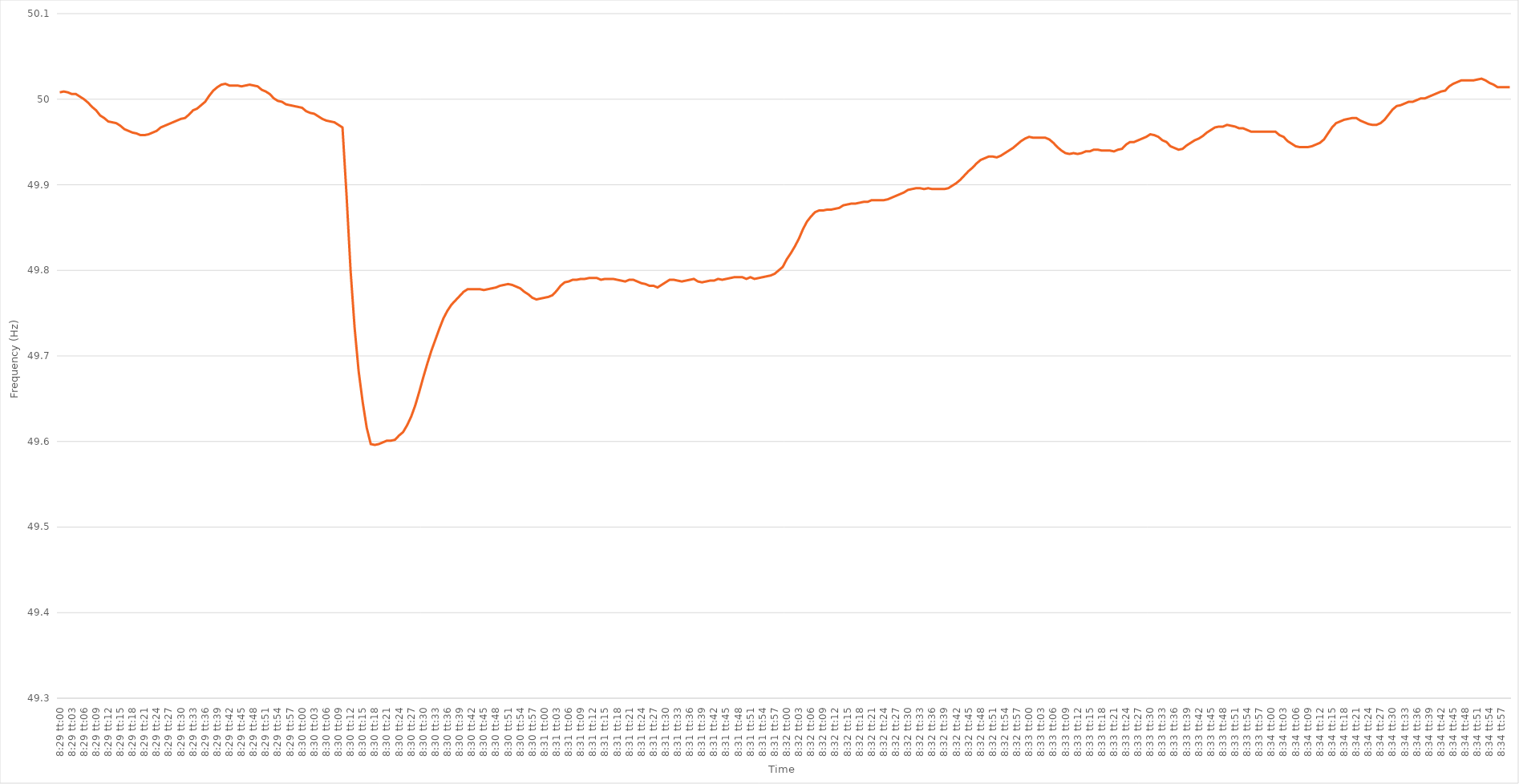
| Category | Series 0 |
|---|---|
| 0.3534722222222222 | 50.008 |
| 0.3534837962962963 | 50.009 |
| 0.3534953703703703 | 50.008 |
| 0.35350694444444447 | 50.006 |
| 0.3535185185185185 | 50.006 |
| 0.3535300925925926 | 50.003 |
| 0.35354166666666664 | 50 |
| 0.35355324074074074 | 49.996 |
| 0.3535648148148148 | 49.991 |
| 0.3535763888888889 | 49.987 |
| 0.35358796296296297 | 49.981 |
| 0.35359953703703706 | 49.978 |
| 0.3536111111111111 | 49.974 |
| 0.3536226851851852 | 49.973 |
| 0.35363425925925923 | 49.972 |
| 0.3536458333333334 | 49.969 |
| 0.3536574074074074 | 49.965 |
| 0.3536689814814815 | 49.963 |
| 0.35368055555555555 | 49.961 |
| 0.35369212962962965 | 49.96 |
| 0.3537037037037037 | 49.958 |
| 0.3537152777777777 | 49.958 |
| 0.3537268518518519 | 49.959 |
| 0.3537384259259259 | 49.961 |
| 0.35375 | 49.963 |
| 0.35376157407407405 | 49.967 |
| 0.35377314814814814 | 49.969 |
| 0.3537847222222222 | 49.971 |
| 0.35379629629629633 | 49.973 |
| 0.35380787037037037 | 49.975 |
| 0.35381944444444446 | 49.977 |
| 0.3538310185185185 | 49.978 |
| 0.3538425925925926 | 49.982 |
| 0.35385416666666664 | 49.987 |
| 0.3538657407407408 | 49.989 |
| 0.3538773148148148 | 49.993 |
| 0.3538888888888889 | 49.997 |
| 0.35390046296296296 | 50.004 |
| 0.35391203703703705 | 50.01 |
| 0.3539236111111111 | 50.014 |
| 0.35393518518518513 | 50.017 |
| 0.3539467592592593 | 50.018 |
| 0.3539583333333333 | 50.016 |
| 0.3539699074074074 | 50.016 |
| 0.35398148148148145 | 50.016 |
| 0.35399305555555555 | 50.015 |
| 0.3540046296296296 | 50.016 |
| 0.35401620370370374 | 50.017 |
| 0.3540277777777778 | 50.016 |
| 0.35403935185185187 | 50.015 |
| 0.3540509259259259 | 50.011 |
| 0.3540625 | 50.009 |
| 0.35407407407407404 | 50.006 |
| 0.3540856481481482 | 50.001 |
| 0.35409722222222223 | 49.998 |
| 0.3541087962962963 | 49.997 |
| 0.35412037037037036 | 49.994 |
| 0.35413194444444446 | 49.993 |
| 0.3541435185185185 | 49.992 |
| 0.35415509259259265 | 49.991 |
| 0.3541666666666667 | 49.99 |
| 0.3541782407407407 | 49.986 |
| 0.3541898148148148 | 49.984 |
| 0.35420138888888886 | 49.983 |
| 0.35421296296296295 | 49.98 |
| 0.354224537037037 | 49.977 |
| 0.35423611111111114 | 49.975 |
| 0.3542476851851852 | 49.974 |
| 0.3542592592592593 | 49.973 |
| 0.3542708333333333 | 49.97 |
| 0.3542824074074074 | 49.967 |
| 0.35429398148148145 | 49.888 |
| 0.3543055555555556 | 49.8 |
| 0.35431712962962963 | 49.733 |
| 0.35432870370370373 | 49.682 |
| 0.35434027777777777 | 49.646 |
| 0.35435185185185186 | 49.616 |
| 0.3543634259259259 | 49.597 |
| 0.35437500000000005 | 49.596 |
| 0.3543865740740741 | 49.597 |
| 0.3543981481481482 | 49.599 |
| 0.3544097222222222 | 49.601 |
| 0.35442129629629626 | 49.601 |
| 0.35443287037037036 | 49.602 |
| 0.3544444444444444 | 49.607 |
| 0.35445601851851855 | 49.611 |
| 0.3544675925925926 | 49.619 |
| 0.3544791666666667 | 49.629 |
| 0.3544907407407407 | 49.642 |
| 0.3545023148148148 | 49.658 |
| 0.35451388888888885 | 49.675 |
| 0.354525462962963 | 49.691 |
| 0.35453703703703704 | 49.706 |
| 0.35454861111111113 | 49.719 |
| 0.3545601851851852 | 49.732 |
| 0.35457175925925927 | 49.744 |
| 0.3545833333333333 | 49.753 |
| 0.35459490740740746 | 49.76 |
| 0.3546064814814815 | 49.765 |
| 0.3546180555555556 | 49.77 |
| 0.35462962962962963 | 49.775 |
| 0.35464120370370367 | 49.778 |
| 0.35465277777777776 | 49.778 |
| 0.3546643518518518 | 49.778 |
| 0.35467592592592595 | 49.778 |
| 0.3546875 | 49.777 |
| 0.3546990740740741 | 49.778 |
| 0.3547106481481481 | 49.779 |
| 0.3547222222222222 | 49.78 |
| 0.35473379629629626 | 49.782 |
| 0.3547453703703704 | 49.783 |
| 0.35475694444444444 | 49.784 |
| 0.35476851851851854 | 49.783 |
| 0.3547800925925926 | 49.781 |
| 0.35479166666666667 | 49.779 |
| 0.3548032407407407 | 49.775 |
| 0.35481481481481486 | 49.772 |
| 0.3548263888888889 | 49.768 |
| 0.354837962962963 | 49.766 |
| 0.35484953703703703 | 49.767 |
| 0.3548611111111111 | 49.768 |
| 0.35487268518518517 | 49.769 |
| 0.3548842592592593 | 49.771 |
| 0.35489583333333335 | 49.776 |
| 0.3549074074074074 | 49.782 |
| 0.3549189814814815 | 49.786 |
| 0.3549305555555555 | 49.787 |
| 0.3549421296296296 | 49.789 |
| 0.35495370370370366 | 49.789 |
| 0.3549652777777778 | 49.79 |
| 0.35497685185185185 | 49.79 |
| 0.35498842592592594 | 49.791 |
| 0.355 | 49.791 |
| 0.3550115740740741 | 49.791 |
| 0.3550231481481481 | 49.789 |
| 0.35503472222222227 | 49.79 |
| 0.3550462962962963 | 49.79 |
| 0.3550578703703704 | 49.79 |
| 0.35506944444444444 | 49.789 |
| 0.35508101851851853 | 49.788 |
| 0.35509259259259257 | 49.787 |
| 0.3551041666666667 | 49.789 |
| 0.35511574074074076 | 49.789 |
| 0.3551273148148148 | 49.787 |
| 0.3551388888888889 | 49.785 |
| 0.35515046296296293 | 49.784 |
| 0.355162037037037 | 49.782 |
| 0.35517361111111106 | 49.782 |
| 0.3551851851851852 | 49.78 |
| 0.35519675925925925 | 49.783 |
| 0.35520833333333335 | 49.786 |
| 0.3552199074074074 | 49.789 |
| 0.3552314814814815 | 49.789 |
| 0.3552430555555555 | 49.788 |
| 0.35525462962962967 | 49.787 |
| 0.3552662037037037 | 49.788 |
| 0.3552777777777778 | 49.789 |
| 0.35528935185185184 | 49.79 |
| 0.35530092592592594 | 49.787 |
| 0.3553125 | 49.786 |
| 0.3553240740740741 | 49.787 |
| 0.35533564814814816 | 49.788 |
| 0.3553472222222222 | 49.788 |
| 0.3553587962962963 | 49.79 |
| 0.35537037037037034 | 49.789 |
| 0.35538194444444443 | 49.79 |
| 0.35539351851851847 | 49.791 |
| 0.3554050925925926 | 49.792 |
| 0.35541666666666666 | 49.792 |
| 0.35542824074074075 | 49.792 |
| 0.3554398148148148 | 49.79 |
| 0.3554513888888889 | 49.792 |
| 0.3554629629629629 | 49.79 |
| 0.3554745370370371 | 49.791 |
| 0.3554861111111111 | 49.792 |
| 0.3554976851851852 | 49.793 |
| 0.35550925925925925 | 49.794 |
| 0.35552083333333334 | 49.796 |
| 0.3555324074074074 | 49.8 |
| 0.35554398148148153 | 49.804 |
| 0.35555555555555557 | 49.813 |
| 0.35556712962962966 | 49.82 |
| 0.3555787037037037 | 49.828 |
| 0.35559027777777774 | 49.837 |
| 0.35560185185185184 | 49.848 |
| 0.3556134259259259 | 49.857 |
| 0.355625 | 49.863 |
| 0.35563657407407406 | 49.868 |
| 0.35564814814814816 | 49.87 |
| 0.3556597222222222 | 49.87 |
| 0.3556712962962963 | 49.871 |
| 0.35568287037037033 | 49.871 |
| 0.3556944444444445 | 49.872 |
| 0.3557060185185185 | 49.873 |
| 0.3557175925925926 | 49.876 |
| 0.35572916666666665 | 49.877 |
| 0.35574074074074075 | 49.878 |
| 0.3557523148148148 | 49.878 |
| 0.35576388888888894 | 49.879 |
| 0.355775462962963 | 49.88 |
| 0.35578703703703707 | 49.88 |
| 0.3557986111111111 | 49.882 |
| 0.3558101851851852 | 49.882 |
| 0.35582175925925924 | 49.882 |
| 0.3558333333333333 | 49.882 |
| 0.35584490740740743 | 49.883 |
| 0.35585648148148147 | 49.885 |
| 0.35586805555555556 | 49.887 |
| 0.3558796296296296 | 49.889 |
| 0.3558912037037037 | 49.891 |
| 0.35590277777777773 | 49.894 |
| 0.3559143518518519 | 49.895 |
| 0.3559259259259259 | 49.896 |
| 0.3559375 | 49.896 |
| 0.35594907407407406 | 49.895 |
| 0.35596064814814815 | 49.896 |
| 0.3559722222222222 | 49.895 |
| 0.35598379629629634 | 49.895 |
| 0.3559953703703704 | 49.895 |
| 0.3560069444444445 | 49.895 |
| 0.3560185185185185 | 49.896 |
| 0.3560300925925926 | 49.899 |
| 0.35604166666666665 | 49.902 |
| 0.3560532407407408 | 49.906 |
| 0.35606481481481483 | 49.911 |
| 0.3560763888888889 | 49.916 |
| 0.35608796296296297 | 49.92 |
| 0.356099537037037 | 49.925 |
| 0.3561111111111111 | 49.929 |
| 0.35612268518518514 | 49.931 |
| 0.3561342592592593 | 49.933 |
| 0.35614583333333333 | 49.933 |
| 0.3561574074074074 | 49.932 |
| 0.35616898148148146 | 49.934 |
| 0.35618055555555556 | 49.937 |
| 0.3561921296296296 | 49.94 |
| 0.35620370370370374 | 49.943 |
| 0.3562152777777778 | 49.947 |
| 0.3562268518518519 | 49.951 |
| 0.3562384259259259 | 49.954 |
| 0.35625 | 49.956 |
| 0.35626157407407405 | 49.955 |
| 0.3562731481481482 | 49.955 |
| 0.35628472222222224 | 49.955 |
| 0.35629629629629633 | 49.955 |
| 0.35630787037037037 | 49.953 |
| 0.3563194444444444 | 49.949 |
| 0.3563310185185185 | 49.944 |
| 0.35634259259259254 | 49.94 |
| 0.3563541666666667 | 49.937 |
| 0.35636574074074073 | 49.936 |
| 0.3563773148148148 | 49.937 |
| 0.35638888888888887 | 49.936 |
| 0.35640046296296296 | 49.937 |
| 0.356412037037037 | 49.939 |
| 0.35642361111111115 | 49.939 |
| 0.3564351851851852 | 49.941 |
| 0.3564467592592593 | 49.941 |
| 0.3564583333333333 | 49.94 |
| 0.3564699074074074 | 49.94 |
| 0.35648148148148145 | 49.94 |
| 0.3564930555555556 | 49.939 |
| 0.35650462962962964 | 49.941 |
| 0.35651620370370374 | 49.942 |
| 0.3565277777777778 | 49.947 |
| 0.3565393518518518 | 49.95 |
| 0.3565509259259259 | 49.95 |
| 0.35656249999999995 | 49.952 |
| 0.3565740740740741 | 49.954 |
| 0.35658564814814814 | 49.956 |
| 0.35659722222222223 | 49.959 |
| 0.35660879629629627 | 49.958 |
| 0.35662037037037037 | 49.956 |
| 0.3566319444444444 | 49.952 |
| 0.35664351851851855 | 49.95 |
| 0.3566550925925926 | 49.945 |
| 0.3566666666666667 | 49.943 |
| 0.3566782407407407 | 49.941 |
| 0.3566898148148148 | 49.942 |
| 0.35670138888888886 | 49.946 |
| 0.356712962962963 | 49.949 |
| 0.35672453703703705 | 49.952 |
| 0.35673611111111114 | 49.954 |
| 0.3567476851851852 | 49.957 |
| 0.3567592592592593 | 49.961 |
| 0.3567708333333333 | 49.964 |
| 0.35678240740740735 | 49.967 |
| 0.3567939814814815 | 49.968 |
| 0.35680555555555554 | 49.968 |
| 0.35681712962962964 | 49.97 |
| 0.3568287037037037 | 49.969 |
| 0.35684027777777777 | 49.968 |
| 0.3568518518518518 | 49.966 |
| 0.35686342592592596 | 49.966 |
| 0.356875 | 49.964 |
| 0.3568865740740741 | 49.962 |
| 0.35689814814814813 | 49.962 |
| 0.3569097222222222 | 49.962 |
| 0.35692129629629626 | 49.962 |
| 0.3569328703703704 | 49.962 |
| 0.35694444444444445 | 49.962 |
| 0.35695601851851855 | 49.962 |
| 0.3569675925925926 | 49.958 |
| 0.3569791666666667 | 49.956 |
| 0.3569907407407407 | 49.951 |
| 0.35700231481481487 | 49.948 |
| 0.3570138888888889 | 49.945 |
| 0.35702546296296295 | 49.944 |
| 0.35703703703703704 | 49.944 |
| 0.3570486111111111 | 49.944 |
| 0.3570601851851852 | 49.945 |
| 0.3570717592592592 | 49.947 |
| 0.35708333333333336 | 49.949 |
| 0.3570949074074074 | 49.953 |
| 0.3571064814814815 | 49.96 |
| 0.35711805555555554 | 49.967 |
| 0.35712962962962963 | 49.972 |
| 0.35714120370370367 | 49.974 |
| 0.3571527777777778 | 49.976 |
| 0.35716435185185186 | 49.977 |
| 0.35717592592592595 | 49.978 |
| 0.3571875 | 49.978 |
| 0.3571990740740741 | 49.975 |
| 0.3572106481481481 | 49.973 |
| 0.3572222222222223 | 49.971 |
| 0.3572337962962963 | 49.97 |
| 0.35724537037037035 | 49.97 |
| 0.35725694444444445 | 49.972 |
| 0.3572685185185185 | 49.976 |
| 0.3572800925925926 | 49.982 |
| 0.3572916666666666 | 49.988 |
| 0.35730324074074077 | 49.992 |
| 0.3573148148148148 | 49.993 |
| 0.3573263888888889 | 49.995 |
| 0.35733796296296294 | 49.997 |
| 0.35734953703703703 | 49.997 |
| 0.3573611111111111 | 49.999 |
| 0.3573726851851852 | 50.001 |
| 0.35738425925925926 | 50.001 |
| 0.35739583333333336 | 50.003 |
| 0.3574074074074074 | 50.005 |
| 0.3574189814814815 | 50.007 |
| 0.35743055555555553 | 50.009 |
| 0.3574421296296297 | 50.01 |
| 0.3574537037037037 | 50.015 |
| 0.3574652777777778 | 50.018 |
| 0.35747685185185185 | 50.02 |
| 0.3574884259259259 | 50.022 |
| 0.3575 | 50.022 |
| 0.357511574074074 | 50.022 |
| 0.3575231481481482 | 50.022 |
| 0.3575347222222222 | 50.023 |
| 0.3575462962962963 | 50.024 |
| 0.35755787037037035 | 50.022 |
| 0.35756944444444444 | 50.019 |
| 0.3575810185185185 | 50.017 |
| 0.35759259259259263 | 50.014 |
| 0.35760416666666667 | 50.014 |
| 0.35761574074074076 | 50.014 |
| 0.3576273148148148 | 50.014 |